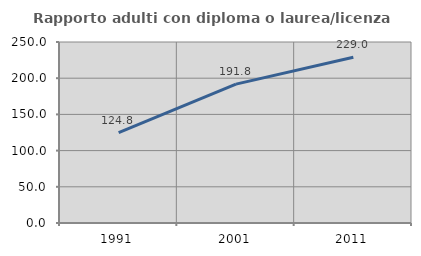
| Category | Rapporto adulti con diploma o laurea/licenza media  |
|---|---|
| 1991.0 | 124.824 |
| 2001.0 | 191.835 |
| 2011.0 | 228.983 |